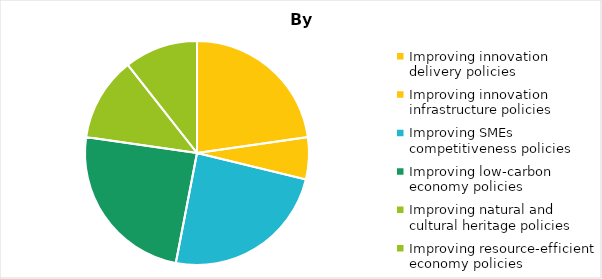
| Category | Total |
|---|---|
| Improving innovation delivery policies | 15 |
| Improving innovation infrastructure policies | 4 |
| Improving SMEs competitiveness policies | 16 |
| Improving low-carbon economy policies | 16 |
| Improving natural and cultural heritage policies | 8 |
| Improving resource-efficient economy policies | 7 |